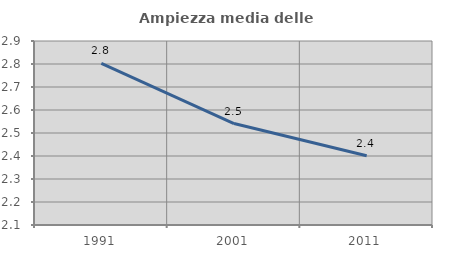
| Category | Ampiezza media delle famiglie |
|---|---|
| 1991.0 | 2.802 |
| 2001.0 | 2.541 |
| 2011.0 | 2.401 |